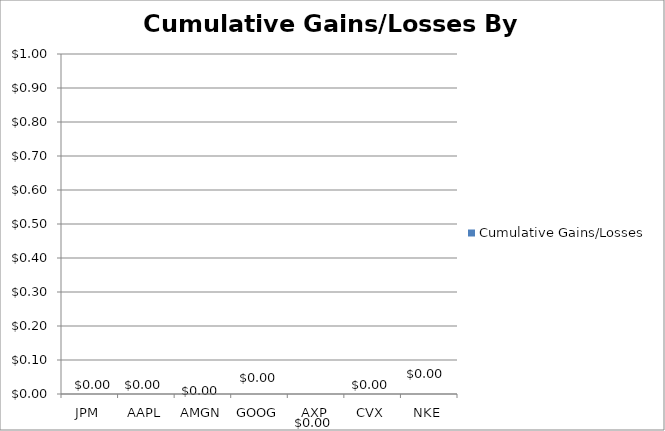
| Category | Cumulative Gains/Losses |
|---|---|
| JPM | 0 |
| AAPL | 0 |
| AMGN | 0 |
| GOOG | 0 |
| AXP | 0 |
| CVX | 0 |
| NKE | 0 |